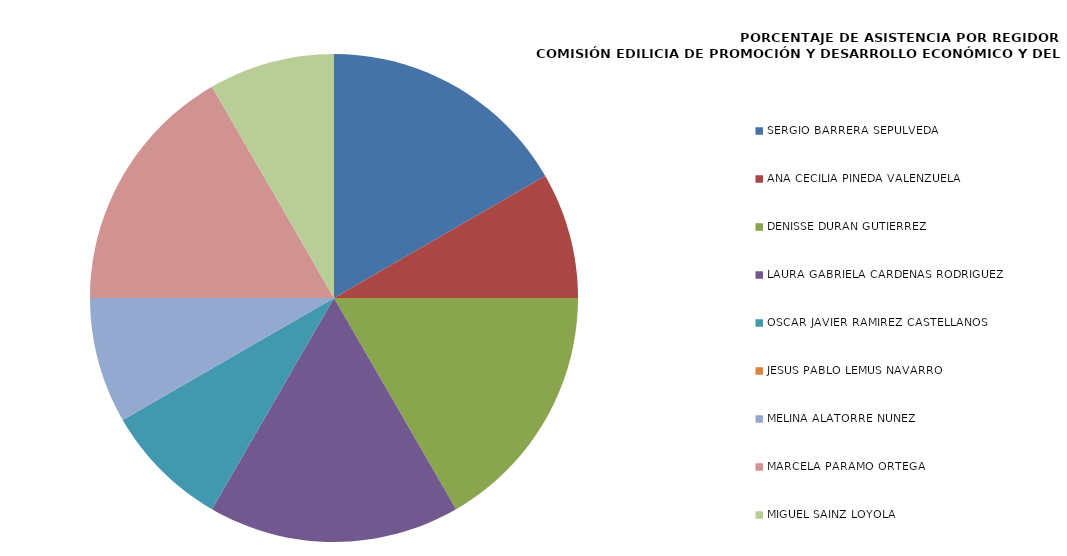
| Category | Series 0 |
|---|---|
| SERGIO BARRERA SEPÚLVEDA | 100 |
| ANA CECILIA PINEDA VALENZUELA | 50 |
| DENISSE DURÁN GUTIÉRREZ | 100 |
| LAURA GABRIELA CÁRDENAS RODRÍGUEZ | 100 |
| ÓSCAR JAVIER RAMÍREZ CASTELLANOS | 50 |
| JESÚS PABLO LEMUS NAVARRO | 0 |
| MELINA ALATORRE NÚÑEZ | 50 |
| MARCELA PÁRAMO ORTEGA | 100 |
| MIGUEL SAINZ LOYOLA | 50 |